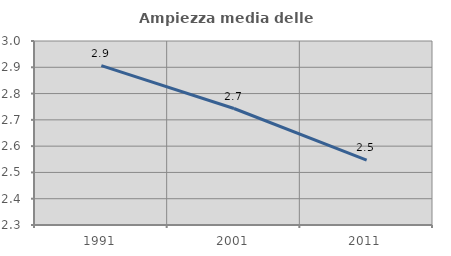
| Category | Ampiezza media delle famiglie |
|---|---|
| 1991.0 | 2.907 |
| 2001.0 | 2.743 |
| 2011.0 | 2.547 |